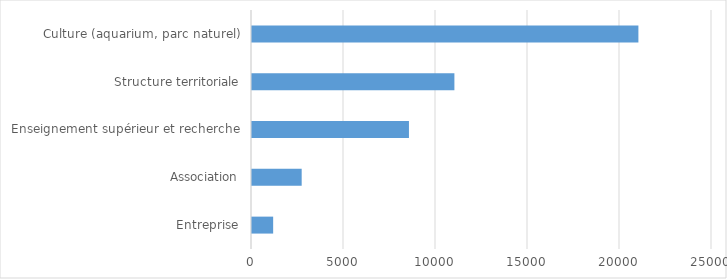
| Category | Entreprise |
|---|---|
| Entreprise | 1150 |
| Association | 2700 |
| Enseignement supérieur et recherche | 8530 |
| Structure territoriale | 11000 |
| Culture (aquarium, parc naturel) | 21000 |